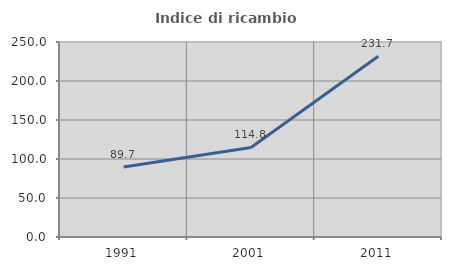
| Category | Indice di ricambio occupazionale  |
|---|---|
| 1991.0 | 89.72 |
| 2001.0 | 114.76 |
| 2011.0 | 231.715 |